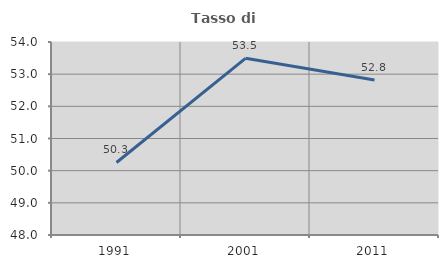
| Category | Tasso di occupazione   |
|---|---|
| 1991.0 | 50.255 |
| 2001.0 | 53.493 |
| 2011.0 | 52.821 |